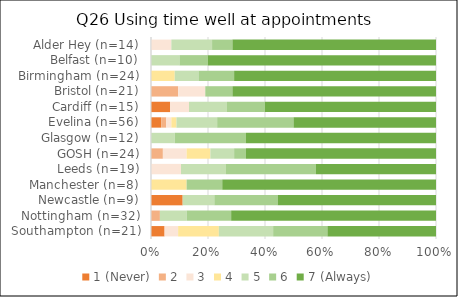
| Category | 1 (Never) | 2 | 3 | 4 | 5 | 6 | 7 (Always) |
|---|---|---|---|---|---|---|---|
| Southampton (n=21) | 1 | 0 | 1 | 3 | 4 | 4 | 8 |
| Nottingham (n=32) | 0 | 1 | 0 | 0 | 3 | 5 | 23 |
| Newcastle (n=9) | 1 | 0 | 0 | 0 | 1 | 2 | 5 |
| Manchester (n=8) | 0 | 0 | 0 | 1 | 0 | 1 | 6 |
| Leeds (n=19) | 0 | 0 | 2 | 0 | 3 | 6 | 8 |
| GOSH (n=24) | 0 | 1 | 2 | 2 | 2 | 1 | 16 |
| Glasgow (n=12) | 0 | 0 | 0 | 0 | 1 | 3 | 8 |
| Evelina (n=56) | 2 | 1 | 1 | 1 | 8 | 15 | 28 |
| Cardiff (n=15) | 1 | 0 | 1 | 0 | 2 | 2 | 9 |
| Bristol (n=21) | 0 | 2 | 2 | 0 | 0 | 2 | 15 |
| Birmingham (n=24) | 0 | 0 | 0 | 2 | 2 | 3 | 17 |
| Belfast (n=10) | 0 | 0 | 0 | 0 | 1 | 1 | 8 |
| Alder Hey (n=14) | 0 | 0 | 1 | 0 | 2 | 1 | 10 |